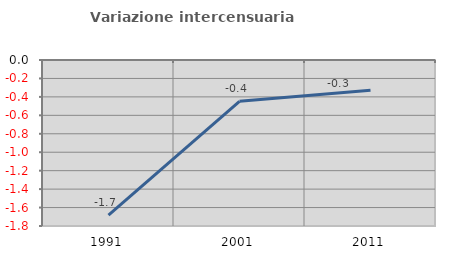
| Category | Variazione intercensuaria annua |
|---|---|
| 1991.0 | -1.682 |
| 2001.0 | -0.449 |
| 2011.0 | -0.329 |